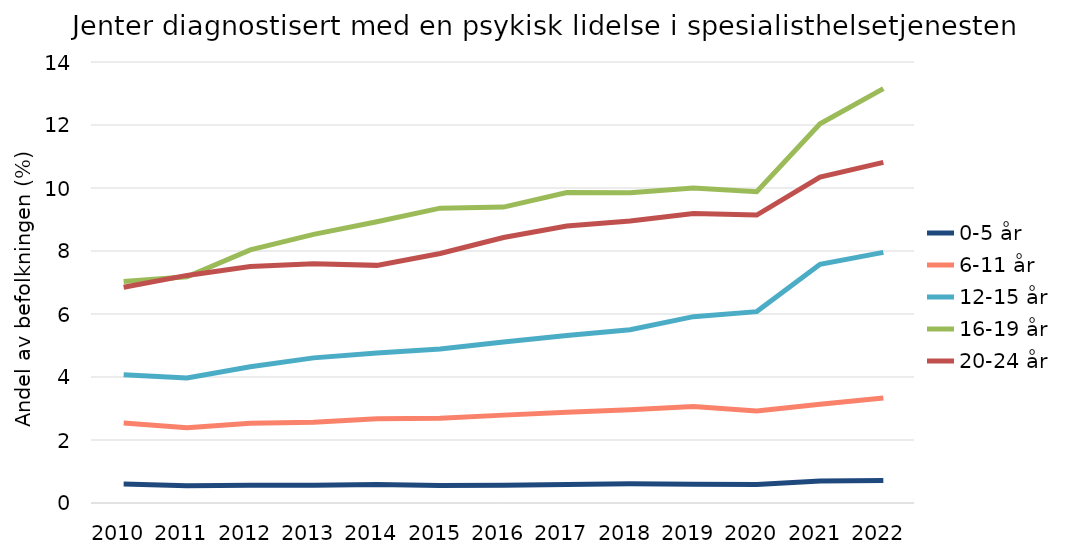
| Category | 0-5 år | 6-11 år | 12-15 år | 16-19 år | 20-24 år |
|---|---|---|---|---|---|
| 2010.0 | 0.599 | 2.538 | 4.068 | 7.034 | 6.849 |
| 2011.0 | 0.551 | 2.393 | 3.968 | 7.184 | 7.225 |
| 2012.0 | 0.565 | 2.535 | 4.326 | 8.036 | 7.51 |
| 2013.0 | 0.562 | 2.564 | 4.607 | 8.527 | 7.595 |
| 2014.0 | 0.59 | 2.677 | 4.764 | 8.927 | 7.544 |
| 2015.0 | 0.555 | 2.689 | 4.886 | 9.36 | 7.921 |
| 2016.0 | 0.565 | 2.79 | 5.109 | 9.393 | 8.429 |
| 2017.0 | 0.59 | 2.882 | 5.316 | 9.857 | 8.793 |
| 2018.0 | 0.609 | 2.958 | 5.502 | 9.851 | 8.955 |
| 2019.0 | 0.594 | 3.064 | 5.916 | 10.002 | 9.193 |
| 2020.0 | 0.586 | 2.923 | 6.075 | 9.883 | 9.14 |
| 2021.0 | 0.7 | 3.135 | 7.576 | 12.04 | 10.344 |
| 2022.0 | 0.718 | 3.331 | 7.955 | 13.157 | 10.815 |